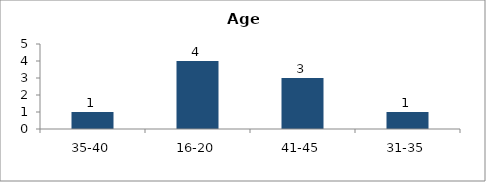
| Category | Age |
|---|---|
| 35-40 | 1 |
| 16-20 | 4 |
| 41-45 | 3 |
| 31-35 | 1 |